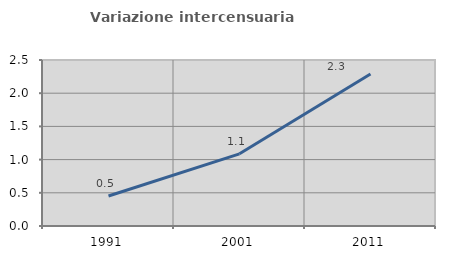
| Category | Variazione intercensuaria annua |
|---|---|
| 1991.0 | 0.451 |
| 2001.0 | 1.087 |
| 2011.0 | 2.29 |